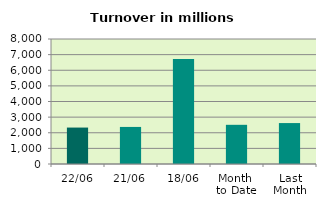
| Category | Series 0 |
|---|---|
| 22/06 | 2332.05 |
| 21/06 | 2372.24 |
| 18/06 | 6714.897 |
| Month 
to Date | 2507.809 |
| Last
Month | 2619.784 |